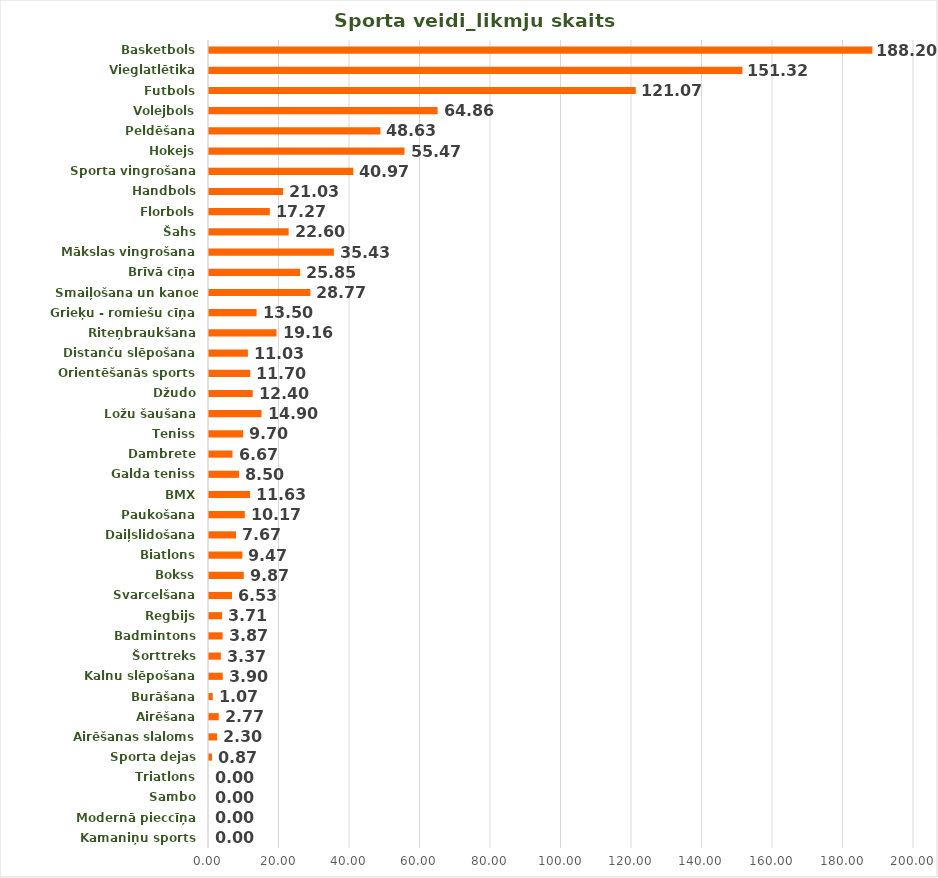
| Category | Likmju 
skaits |
|---|---|
| Kamaniņu sports | 0 |
| Modernā pieccīņa | 0 |
| Sambo | 0 |
| Triatlons | 0 |
| Sporta dejas | 0.867 |
| Airēšanas slaloms | 2.3 |
| Airēšana | 2.767 |
| Burāšana | 1.067 |
| Kalnu slēpošana | 3.9 |
| Šorttreks | 3.367 |
| Badmintons | 3.867 |
| Regbijs | 3.71 |
| Svarcelšana | 6.533 |
| Bokss | 9.867 |
| Biatlons | 9.467 |
| Daiļslidošana | 7.667 |
| Paukošana | 10.167 |
| BMX | 11.633 |
| Galda teniss | 8.504 |
| Dambrete | 6.667 |
| Teniss | 9.7 |
| Ložu šaušana | 14.9 |
| Džudo | 12.4 |
| Orientēšanās sports | 11.7 |
| Distanču slēpošana | 11.033 |
| Riteņbraukšana | 19.157 |
| Grieķu - romiešu cīņa | 13.5 |
| Smaiļošana un kanoe airēšana | 28.767 |
| Brīvā cīņa | 25.853 |
| Mākslas vingrošana | 35.433 |
| Šahs | 22.6 |
| Florbols | 17.27 |
| Handbols | 21.033 |
| Sporta vingrošana | 40.967 |
| Hokejs | 55.467 |
| Peldēšana | 48.633 |
| Volejbols | 64.858 |
| Futbols | 121.067 |
| Vieglatlētika | 151.321 |
| Basketbols | 188.195 |